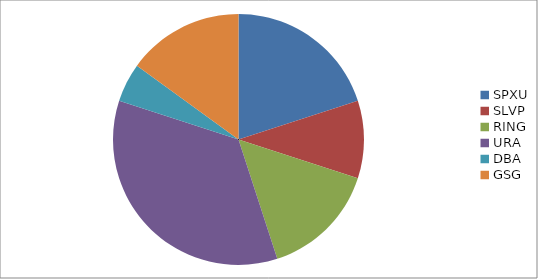
| Category | Series 0 |
|---|---|
| SPXU | 0.2 |
| SLVP | 0.1 |
| RING | 0.15 |
| URA | 0.35 |
| DBA | 0.05 |
| GSG | 0.15 |